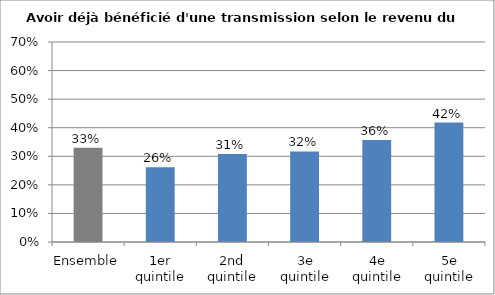
| Category | Avoir déjà bénéficié d'une transmission selon le revenu du foyer |
|---|---|
| Ensemble | 0.33 |
| 1er quintile | 0.262 |
| 2nd quintile | 0.308 |
| 3e quintile | 0.317 |
| 4e quintile | 0.357 |
| 5e quintile | 0.418 |